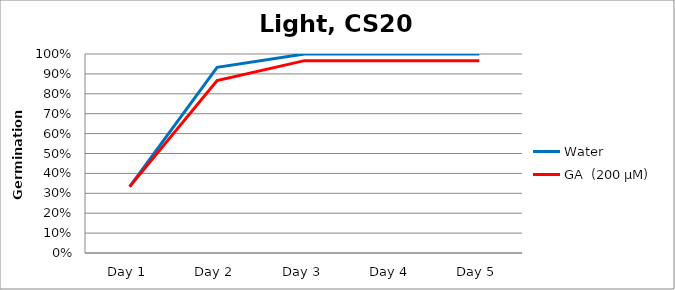
| Category | Water | GA  (200 µM)  |
|---|---|---|
| Day 1 | 0.333 | 0.333 |
| Day 2 | 0.933 | 0.867 |
| Day 3 | 1 | 0.967 |
| Day 4 | 1 | 0.967 |
| Day 5 | 1 | 0.967 |